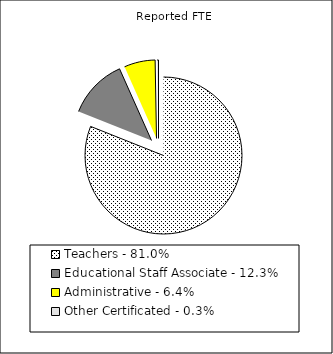
| Category | Reported FTE |
|---|---|
| Teachers - 81.0% | 63034.26 |
| Educational Staff Associate - 12.3% | 9552.33 |
| Administrative - 6.4% | 4972.07 |
| Other Certificated - 0.3% | 218.69 |